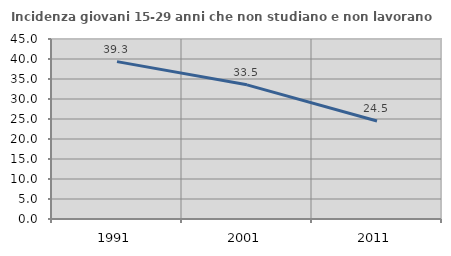
| Category | Incidenza giovani 15-29 anni che non studiano e non lavorano  |
|---|---|
| 1991.0 | 39.349 |
| 2001.0 | 33.544 |
| 2011.0 | 24.498 |